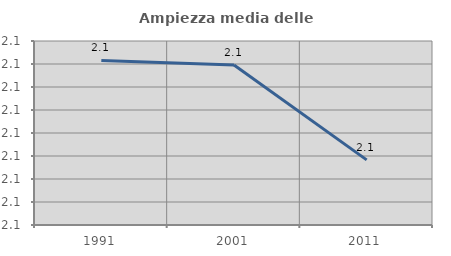
| Category | Ampiezza media delle famiglie |
|---|---|
| 1991.0 | 2.087 |
| 2001.0 | 2.087 |
| 2011.0 | 2.083 |